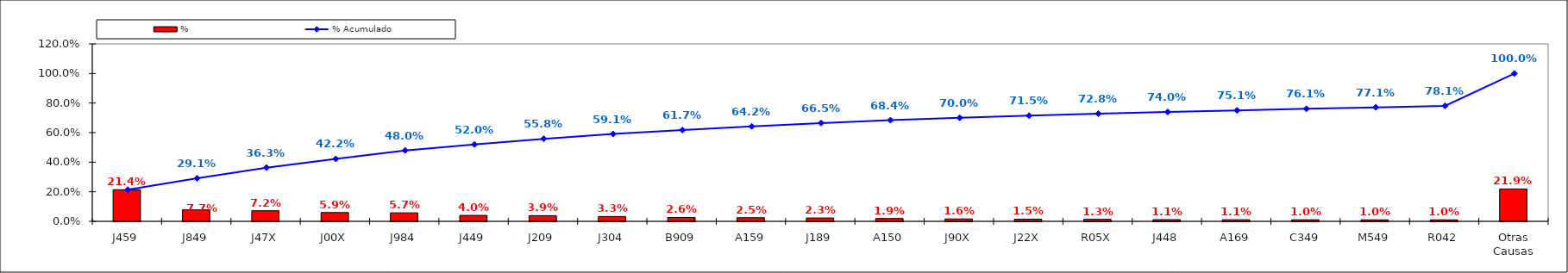
| Category | % |
|---|---|
| J459 | 0.214 |
| J849 | 0.077 |
| J47X | 0.072 |
| J00X | 0.059 |
| J984 | 0.057 |
| J449 | 0.04 |
| J209 | 0.039 |
| J304 | 0.033 |
| B909 | 0.026 |
| A159 | 0.025 |
| J189 | 0.023 |
| A150 | 0.019 |
| J90X | 0.016 |
| J22X | 0.015 |
| R05X | 0.013 |
| J448 | 0.011 |
| A169 | 0.011 |
| C349 | 0.01 |
| M549 | 0.01 |
| R042 | 0.01 |
| Otras Causas | 0.219 |